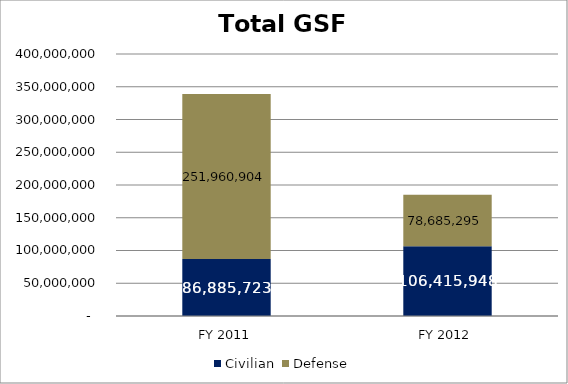
| Category | Civilian | Defense |
|---|---|---|
| FY 2011 | 86885723.32 | 251960903.93 |
| FY 2012 | 106415947.835 | 78685294.76 |